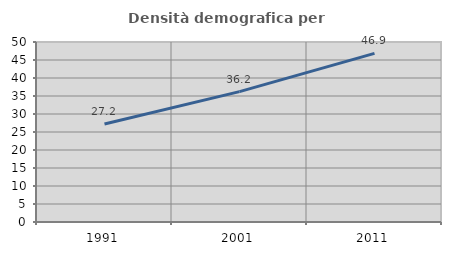
| Category | Densità demografica |
|---|---|
| 1991.0 | 27.233 |
| 2001.0 | 36.225 |
| 2011.0 | 46.852 |